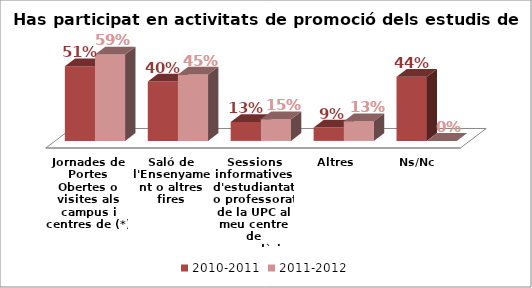
| Category | 2010-2011 | 2011-2012 |
|---|---|---|
| Jornades de Portes Obertes o visites als campus i centres de (*) | 0.506 | 0.586 |
| Saló de l'Ensenyament o altres fires | 0.402 | 0.45 |
| Sessions informatives d'estudiantat o professorat de la UPC al meu centre de secundària | 0.128 | 0.147 |
| Altres | 0.091 | 0.134 |
| Ns/Nc | 0.435 | 0 |